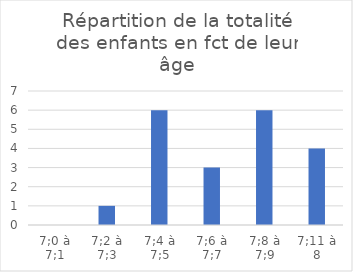
| Category | Series 0 |
|---|---|
| 7;0 à 7;1 | 0 |
| 7;2 à 7;3 | 1 |
| 7;4 à 7;5 | 6 |
| 7;6 à 7;7 | 3 |
| 7;8 à 7;9 | 6 |
| 7;11 à 8 | 4 |